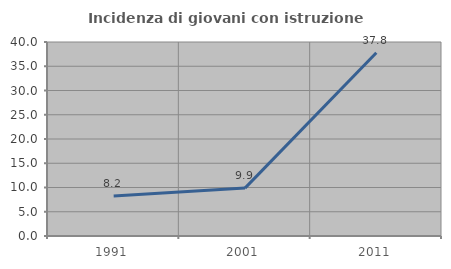
| Category | Incidenza di giovani con istruzione universitaria |
|---|---|
| 1991.0 | 8.235 |
| 2001.0 | 9.877 |
| 2011.0 | 37.778 |